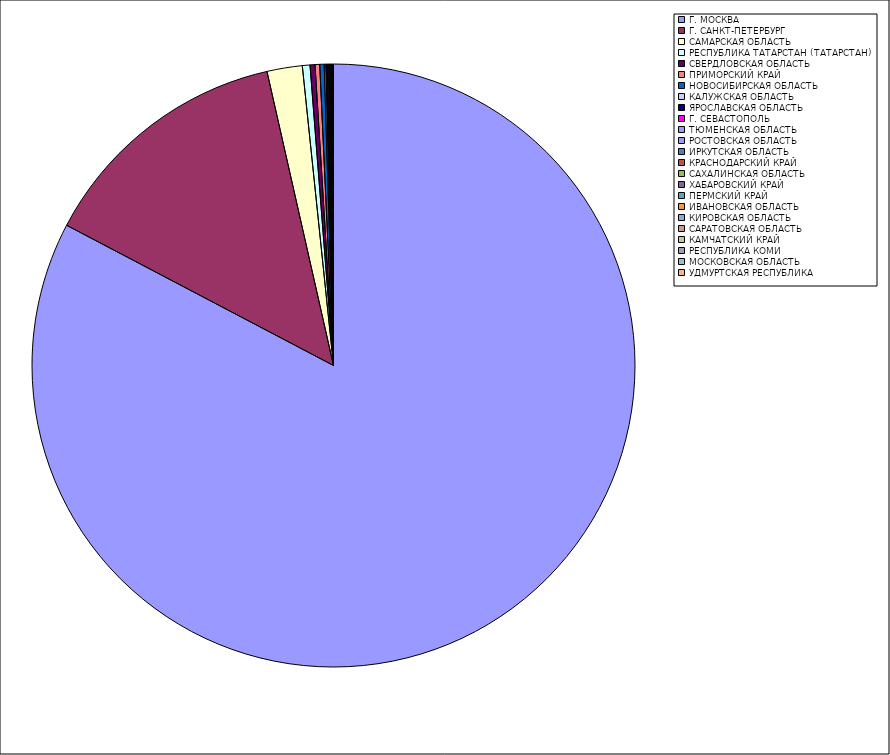
| Category | Оборот |
|---|---|
| Г. МОСКВА | 82.677 |
| Г. САНКТ-ПЕТЕРБУРГ | 13.754 |
| САМАРСКАЯ ОБЛАСТЬ | 1.89 |
| РЕСПУБЛИКА ТАТАРСТАН (ТАТАРСТАН) | 0.409 |
| СВЕРДЛОВСКАЯ ОБЛАСТЬ | 0.266 |
| ПРИМОРСКИЙ КРАЙ | 0.247 |
| НОВОСИБИРСКАЯ ОБЛАСТЬ | 0.237 |
| КАЛУЖСКАЯ ОБЛАСТЬ | 0.085 |
| ЯРОСЛАВСКАЯ ОБЛАСТЬ | 0.078 |
| Г. СЕВАСТОПОЛЬ | 0.059 |
| ТЮМЕНСКАЯ ОБЛАСТЬ | 0.05 |
| РОСТОВСКАЯ ОБЛАСТЬ | 0.044 |
| ИРКУТСКАЯ ОБЛАСТЬ | 0.042 |
| КРАСНОДАРСКИЙ КРАЙ | 0.041 |
| САХАЛИНСКАЯ ОБЛАСТЬ | 0.019 |
| ХАБАРОВСКИЙ КРАЙ | 0.014 |
| ПЕРМСКИЙ КРАЙ | 0.013 |
| ИВАНОВСКАЯ ОБЛАСТЬ | 0.01 |
| КИРОВСКАЯ ОБЛАСТЬ | 0.008 |
| САРАТОВСКАЯ ОБЛАСТЬ | 0.007 |
| КАМЧАТСКИЙ КРАЙ | 0.007 |
| РЕСПУБЛИКА КОМИ | 0.006 |
| МОСКОВСКАЯ ОБЛАСТЬ | 0.005 |
| УДМУРТСКАЯ РЕСПУБЛИКА | 0.004 |